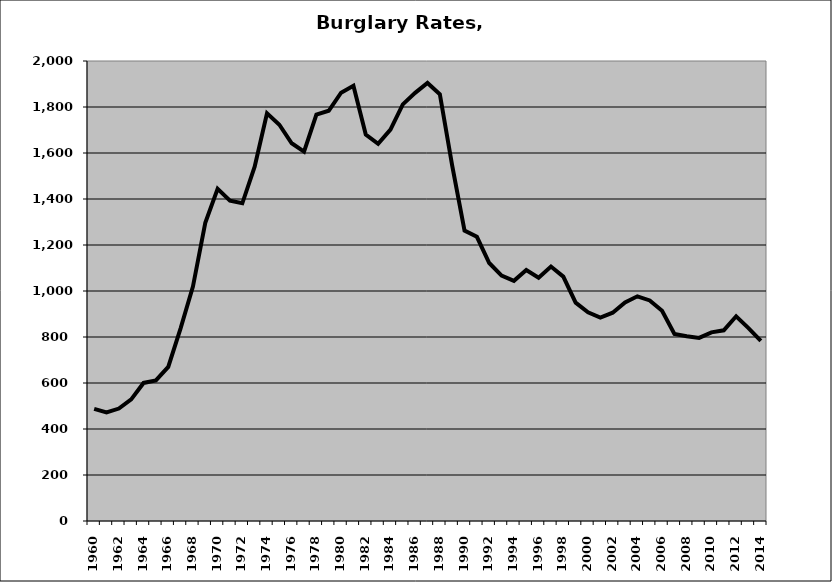
| Category | Burglary |
|---|---|
| 1960.0 | 487.45 |
| 1961.0 | 471.881 |
| 1962.0 | 488.856 |
| 1963.0 | 528.984 |
| 1964.0 | 600.335 |
| 1965.0 | 611.07 |
| 1966.0 | 669.732 |
| 1967.0 | 837.674 |
| 1968.0 | 1019.505 |
| 1969.0 | 1296.473 |
| 1970.0 | 1444.458 |
| 1971.0 | 1392.81 |
| 1972.0 | 1381.441 |
| 1973.0 | 1540.362 |
| 1974.0 | 1772.468 |
| 1975.0 | 1723.053 |
| 1976.0 | 1642.414 |
| 1977.0 | 1605.577 |
| 1978.0 | 1766.614 |
| 1979.0 | 1783.597 |
| 1980.0 | 1862.189 |
| 1981.0 | 1892.118 |
| 1982.0 | 1680.141 |
| 1983.0 | 1640.14 |
| 1984.0 | 1702.023 |
| 1985.0 | 1811.272 |
| 1986.0 | 1861.483 |
| 1987.0 | 1904.539 |
| 1988.0 | 1855.618 |
| 1989.0 | 1545.117 |
| 1990.0 | 1262.87 |
| 1991.0 | 1235.472 |
| 1992.0 | 1121.729 |
| 1993.0 | 1067.231 |
| 1994.0 | 1044.226 |
| 1995.0 | 1091.235 |
| 1996.0 | 1057.509 |
| 1997.0 | 1106.31 |
| 1998.0 | 1062.507 |
| 1999.0 | 949.419 |
| 2000.0 | 907.277 |
| 2001.0 | 884.708 |
| 2002.0 | 905.678 |
| 2003.0 | 950.386 |
| 2004.0 | 976.825 |
| 2005.0 | 959.059 |
| 2006.0 | 913.819 |
| 2007.0 | 813.026 |
| 2008.0 | 803.464 |
| 2009.0 | 796 |
| 2010.0 | 820.339 |
| 2011.0 | 828.943 |
| 2012.0 | 890.111 |
| 2013.0 | 838.675 |
| 2014.0 | 782.975 |